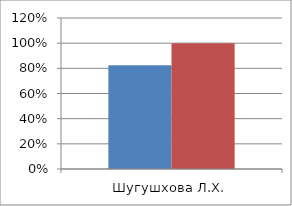
| Category | Series 0 | 2 |
|---|---|---|
| Шугушхова Л.Х. | 0.824 | 1 |